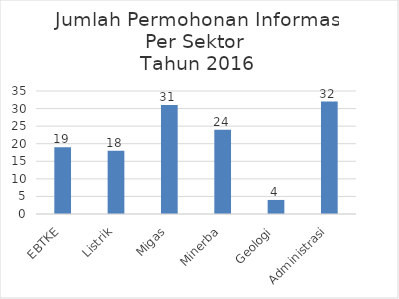
| Category | Jumlah Permohonan |
|---|---|
| EBTKE | 19 |
| Listrik | 18 |
| Migas | 31 |
| Minerba | 24 |
| Geologi | 4 |
| Administrasi | 32 |